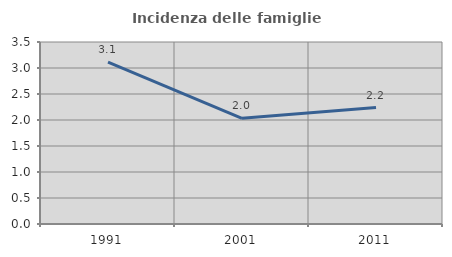
| Category | Incidenza delle famiglie numerose |
|---|---|
| 1991.0 | 3.114 |
| 2001.0 | 2.032 |
| 2011.0 | 2.24 |